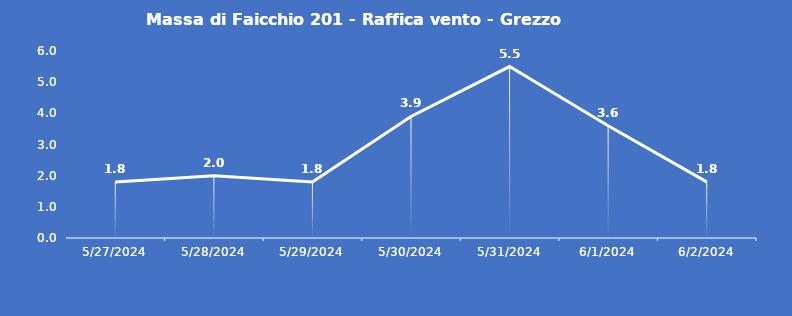
| Category | Massa di Faicchio 201 - Raffica vento - Grezzo (m/s) |
|---|---|
| 5/27/24 | 1.8 |
| 5/28/24 | 2 |
| 5/29/24 | 1.8 |
| 5/30/24 | 3.9 |
| 5/31/24 | 5.5 |
| 6/1/24 | 3.6 |
| 6/2/24 | 1.8 |